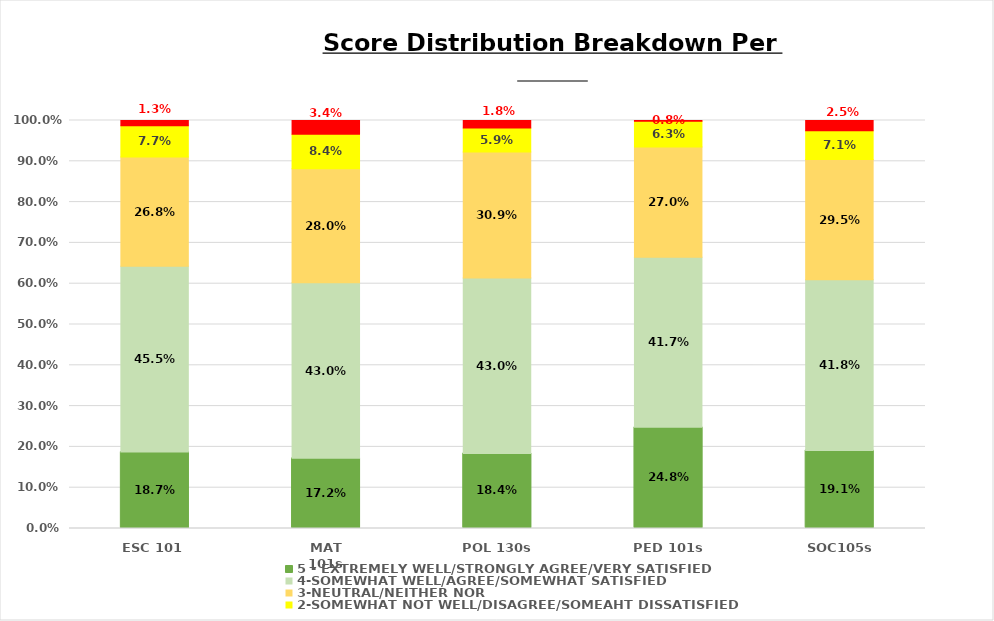
| Category | 5 - EXTREMELY WELL/STRONGLY AGREE/VERY SATISFIED | 4-SOMEWHAT WELL/AGREE/SOMEWHAT SATISFIED | 3-NEUTRAL/NEITHER NOR | 2-SOMEWHAT NOT WELL/DISAGREE/SOMEAHT DISSATISFIED | 1 - EXTREMELY NOT WELL/STRONGLY DISAGREE/VERY DISSATISFIED |
|---|---|---|---|---|---|
| ESC 101 | 0.187 | 0.455 | 0.268 | 0.077 | 0.013 |
| MAT 101s | 0.172 | 0.43 | 0.28 | 0.084 | 0.034 |
| POL 130s | 0.184 | 0.43 | 0.309 | 0.059 | 0.018 |
| PED 101s | 0.248 | 0.417 | 0.27 | 0.063 | 0.008 |
| SOC105s | 0.191 | 0.418 | 0.295 | 0.071 | 0.025 |